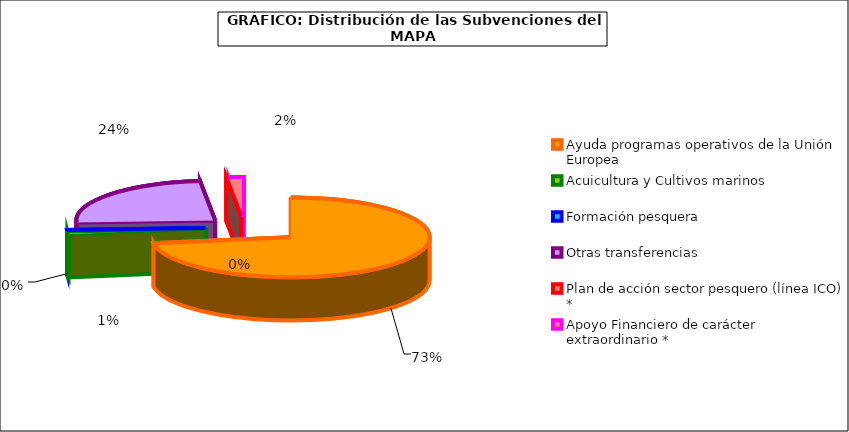
| Category | Series 0 |
|---|---|
| Ayuda programas operativos de la Unión Europea  | 20704.23 |
| Acuicultura y Cultivos marinos | 320 |
| Formación pesquera | 120.54 |
| Otras transferencias | 6843.97 |
| Plan de acción sector pesquero (línea ICO) * | 0 |
| Apoyo Financiero de carácter extraordinario * | 500 |